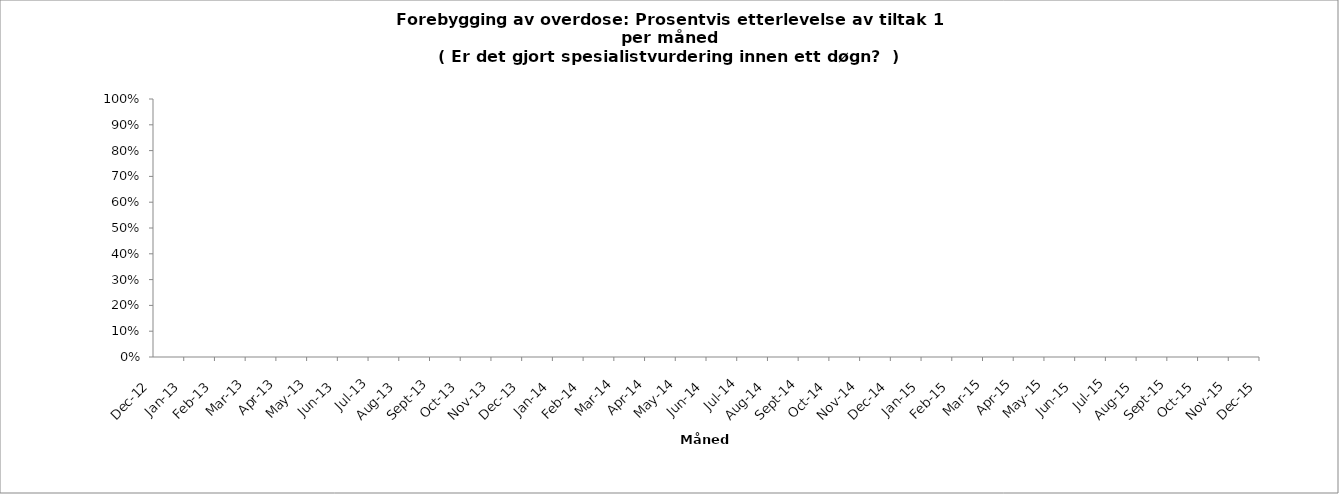
| Category | p_P1 | m_P1 |
|---|---|---|
| 2012-12-01 |  | 0 |
| 2013-01-01 |  | 0 |
| 2013-02-01 |  | 0 |
| 2013-03-01 |  | 0 |
| 2013-04-01 |  | 0 |
| 2013-05-01 |  | 0 |
| 2013-06-01 |  | 0 |
| 2013-07-01 |  | 0 |
| 2013-08-01 |  | 0 |
| 2013-09-01 |  | 0 |
| 2013-10-01 |  | 0 |
| 2013-11-01 |  | 0 |
| 2013-12-01 |  | 0 |
| 2014-01-01 |  | 0 |
| 2014-02-01 |  | 0 |
| 2014-03-01 |  | 0 |
| 2014-04-01 |  | 0 |
| 2014-05-01 |  | 0 |
| 2014-06-01 |  | 0 |
| 2014-07-01 |  | 0 |
| 2014-08-01 |  | 0 |
| 2014-09-01 |  | 0 |
| 2014-10-01 |  | 0 |
| 2014-11-01 |  | 0 |
| 2014-12-01 |  | 0 |
| 2015-01-01 |  | 0 |
| 2015-02-01 |  | 0 |
| 2015-03-01 |  | 0 |
| 2015-04-01 |  | 0 |
| 2015-05-01 |  | 0 |
| 2015-06-01 |  | 0 |
| 2015-07-01 |  | 0 |
| 2015-08-01 |  | 0 |
| 2015-09-01 |  | 0 |
| 2015-10-01 |  | 0 |
| 2015-11-01 |  | 0 |
| 2015-12-01 |  | 0 |